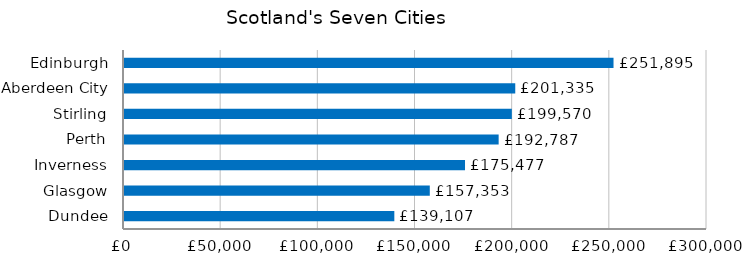
| Category | Series 0 |
|---|---|
| Dundee | 139107.182 |
| Glasgow | 157352.964 |
| Inverness | 175477.22 |
| Perth | 192787.003 |
| Stirling | 199570.092 |
| Aberdeen City | 201335.078 |
| Edinburgh | 251895.298 |